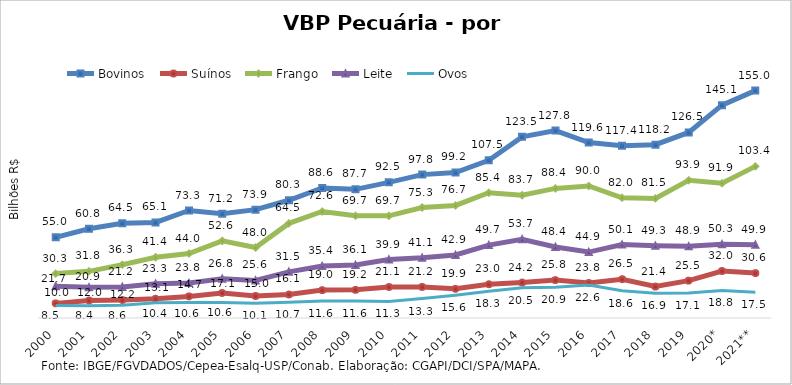
| Category | Bovinos | Suínos | Frango | Leite | Ovos |
|---|---|---|---|---|---|
| 2000 | 55.019 | 9.962 | 30.274 | 21.732 | 8.497 |
| 2001 | 60.818 | 11.952 | 31.821 | 20.912 | 8.373 |
| 2002 | 64.539 | 12.249 | 36.322 | 21.175 | 8.627 |
| 2003 | 65.137 | 13.091 | 41.41 | 23.318 | 10.435 |
| 2004 | 73.287 | 14.719 | 43.972 | 23.833 | 10.576 |
| 2005 | 71.151 | 17.065 | 52.571 | 26.805 | 10.648 |
| 2006 | 73.872 | 15.011 | 48.027 | 25.603 | 10.114 |
| 2007 | 80.282 | 16.052 | 64.528 | 31.475 | 10.749 |
| 2008 | 88.641 | 19.007 | 72.638 | 35.408 | 11.609 |
| 2009 | 87.716 | 19.213 | 69.743 | 36.099 | 11.575 |
| 2010 | 92.479 | 21.136 | 69.658 | 39.866 | 11.258 |
| 2011 | 97.765 | 21.169 | 75.339 | 41.097 | 13.266 |
| 2012 | 99.222 | 19.877 | 76.745 | 42.945 | 15.551 |
| 2013 | 107.522 | 23.015 | 85.418 | 49.696 | 18.29 |
| 2014 | 123.523 | 24.173 | 83.691 | 53.665 | 20.549 |
| 2015 | 127.774 | 25.833 | 88.351 | 48.442 | 20.923 |
| 2016 | 119.603 | 23.84 | 90.024 | 44.948 | 22.557 |
| 2017 | 117.37 | 26.465 | 81.996 | 50.082 | 18.593 |
| 2018 | 118.156 | 21.433 | 81.549 | 49.337 | 16.907 |
| 2019 | 126.519 | 25.475 | 93.895 | 48.88 | 17.123 |
| 2020* | 145.125 | 32.023 | 91.864 | 50.256 | 18.804 |
| 2021** | 155.034 | 30.601 | 103.389 | 49.923 | 17.532 |